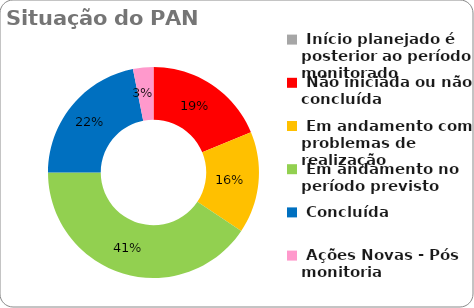
| Category | Series 0 |
|---|---|
|  Início planejado é posterior ao período monitorado | 0 |
|  Não iniciada ou não concluída | 0.188 |
|  Em andamento com problemas de realização | 0.156 |
|  Em andamento no período previsto  | 0.406 |
|  Concluída | 0.219 |
|  Ações Novas - Pós monitoria | 0.031 |